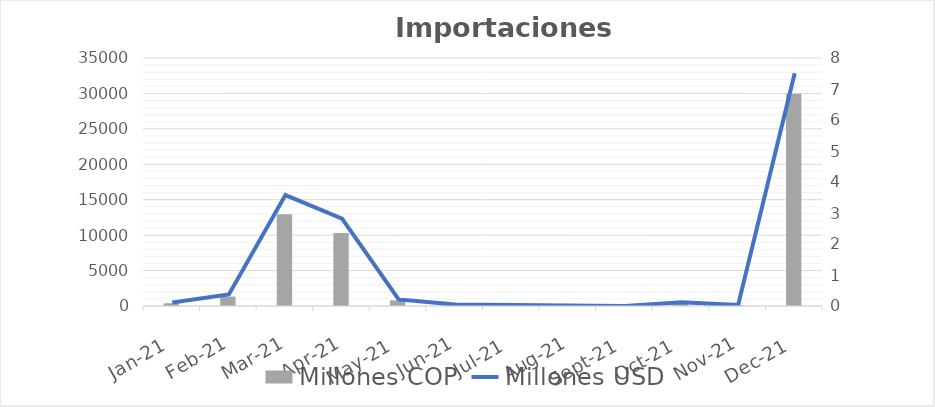
| Category | Millones COP |
|---|---|
| 2021-01-01 | 391.018 |
| 2021-02-01 | 1333.328 |
| 2021-03-01 | 12956.156 |
| 2021-04-01 | 10291.158 |
| 2021-05-01 | 792.641 |
| 2021-06-01 | 168.823 |
| 2021-07-01 | 112.007 |
| 2021-08-01 | 59.285 |
| 2021-09-01 | 14.688 |
| 2021-10-01 | 458.514 |
| 2021-11-01 | 117.518 |
| 2021-12-01 | 29959.065 |